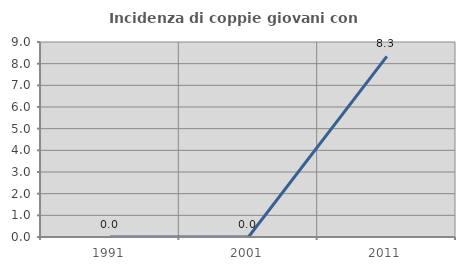
| Category | Incidenza di coppie giovani con figli |
|---|---|
| 1991.0 | 0 |
| 2001.0 | 0 |
| 2011.0 | 8.333 |